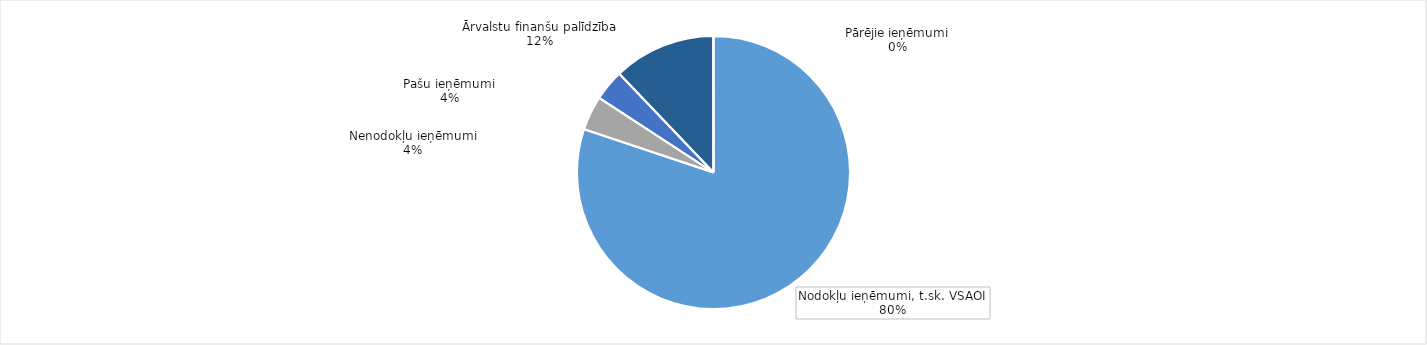
| Category | Series 0 |
|---|---|
| Nodokļu ieņēmumi, t.sk. VSAOI | 948366.56 |
| Nenodokļu ieņēmumi | 48128.2 |
| Pašu ieņēmumi | 43479.034 |
| Ārvalstu finanšu palīdzība | 143295.971 |
| Pārējie ieņēmumi | 227.979 |